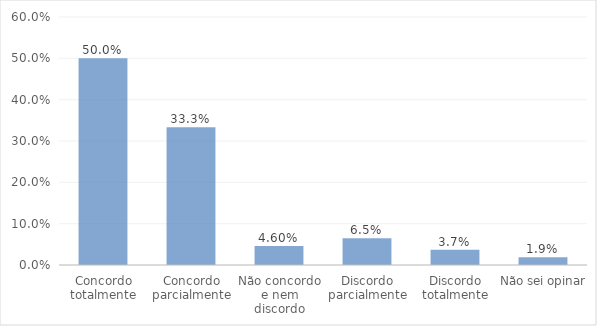
| Category | Series 0 |
|---|---|
| Concordo totalmente | 0.5 |
| Concordo parcialmente | 0.333 |
| Não concordo e nem discordo | 0.046 |
| Discordo parcialmente | 0.065 |
| Discordo totalmente | 0.037 |
| Não sei opinar | 0.019 |